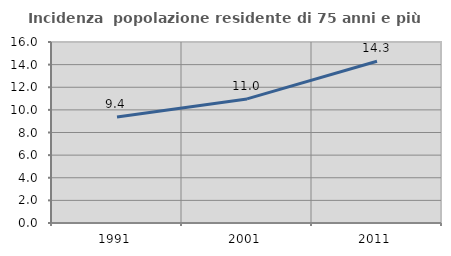
| Category | Incidenza  popolazione residente di 75 anni e più |
|---|---|
| 1991.0 | 9.368 |
| 2001.0 | 10.968 |
| 2011.0 | 14.297 |